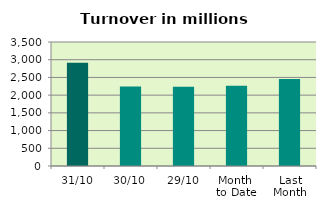
| Category | Series 0 |
|---|---|
| 31/10 | 2917.736 |
| 30/10 | 2247.408 |
| 29/10 | 2234.958 |
| Month 
to Date | 2263.558 |
| Last
Month | 2458.207 |